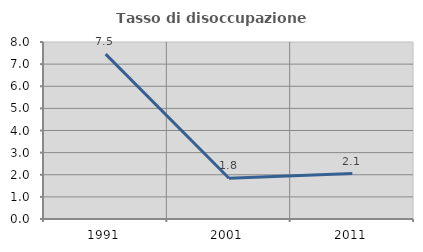
| Category | Tasso di disoccupazione giovanile  |
|---|---|
| 1991.0 | 7.451 |
| 2001.0 | 1.84 |
| 2011.0 | 2.055 |